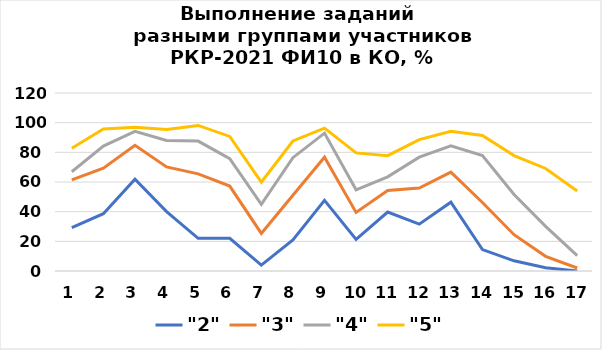
| Category | "2" | "3" | "4" | "5" |
|---|---|---|---|---|
| 1.0 | 29.242 | 61.379 | 66.91 | 82.716 |
| 2.0 | 38.628 | 69.31 | 84.185 | 95.679 |
| 3.0 | 61.864 | 84.767 | 94.104 | 96.951 |
| 4.0 | 40.072 | 70.172 | 87.956 | 95.37 |
| 5.0 | 22.022 | 65.517 | 87.591 | 98.148 |
| 6.0 | 22.022 | 57.241 | 75.669 | 90.741 |
| 7.0 | 3.971 | 25.345 | 45.012 | 59.877 |
| 8.0 | 20.939 | 51.034 | 76.399 | 87.654 |
| 9.0 | 47.653 | 76.724 | 92.944 | 96.296 |
| 10.0 | 21.3 | 39.483 | 54.745 | 79.63 |
| 11.0 | 39.711 | 54.31 | 63.504 | 77.778 |
| 12.0 | 31.588 | 55.948 | 76.764 | 88.58 |
| 13.0 | 46.39 | 66.638 | 84.428 | 94.136 |
| 14.0 | 14.44 | 46.207 | 77.859 | 91.358 |
| 15.0 | 6.859 | 24.483 | 51.582 | 77.778 |
| 16.0 | 2.166 | 9.914 | 30.049 | 69.136 |
| 17.0 | 0 | 2.011 | 10.3 | 53.909 |